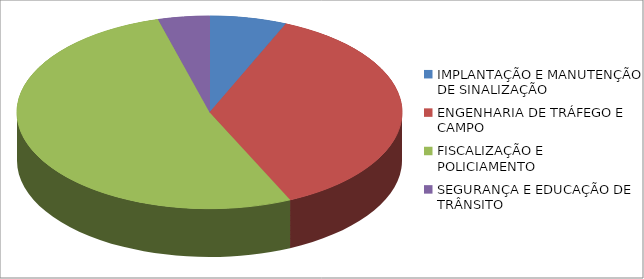
| Category | Series 0 | Series 1 |
|---|---|---|
| IMPLANTAÇÃO E MANUTENÇÃO DE SINALIZAÇÃO | 642204.21 |  |
| ENGENHARIA DE TRÁFEGO E CAMPO | 3632517.35 |  |
| FISCALIZAÇÃO E POLICIAMENTO | 5209123.42 |  |
| SEGURANÇA E EDUCAÇÃO DE TRÂNSITO | 427316.85 |  |